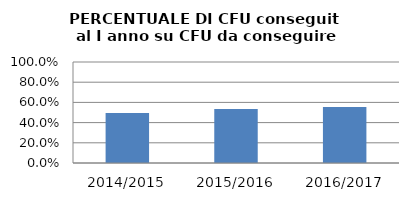
| Category | 2014/2015 2015/2016 2016/2017 |
|---|---|
| 2014/2015 | 0.496 |
| 2015/2016 | 0.535 |
| 2016/2017 | 0.554 |